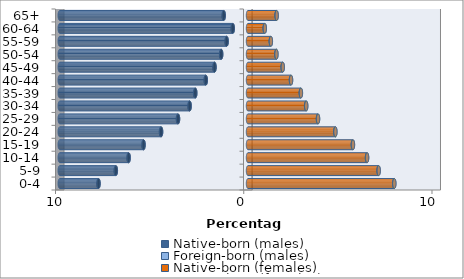
| Category | Native-born (males) | Foreign-born (males) | Native-born (females) | Foreign-born (females) |
|---|---|---|---|---|
| 0-4 | -7.94 | -0.007 | 7.768 | 0.006 |
| 5-9 | -7.02 | -0.007 | 6.936 | 0.006 |
| 10-14 | -6.34 | -0.007 | 6.322 | 0.006 |
| 15-19 | -5.547 | -0.007 | 5.571 | 0.007 |
| 20-24 | -4.617 | -0.007 | 4.637 | 0.007 |
| 25-29 | -3.716 | -0.007 | 3.716 | 0.007 |
| 30-34 | -3.1 | -0.007 | 3.088 | 0.006 |
| 35-39 | -2.801 | -0.007 | 2.807 | 0.005 |
| 40-44 | -2.241 | -0.006 | 2.282 | 0.004 |
| 45-49 | -1.778 | -0.005 | 1.842 | 0.003 |
| 50-54 | -1.424 | -0.005 | 1.507 | 0.003 |
| 55-59 | -1.133 | -0.004 | 1.212 | 0.002 |
| 60-64 | -0.809 | -0.004 | 0.89 | 0.002 |
| 65+ | -1.289 | -0.003 | 1.52 | 0.002 |